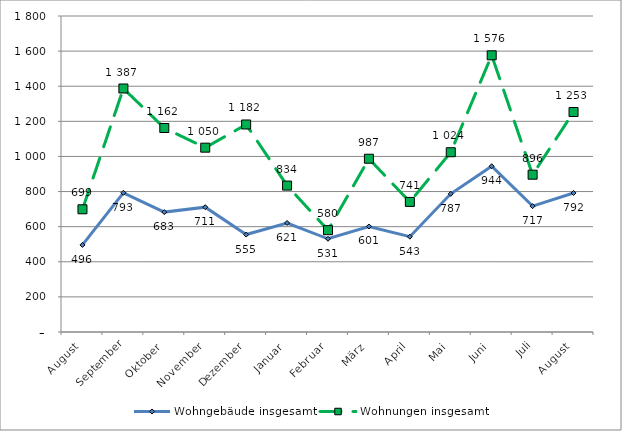
| Category | Wohngebäude insgesamt | Wohnungen insgesamt |
|---|---|---|
| August | 496 | 699 |
| September | 793 | 1387 |
| Oktober | 683 | 1162 |
| November | 711 | 1050 |
| Dezember | 555 | 1182 |
| Januar | 621 | 834 |
| Februar | 531 | 580 |
| März | 601 | 987 |
| April | 543 | 741 |
| Mai | 787 | 1024 |
| Juni | 944 | 1576 |
| Juli | 717 | 896 |
| August | 792 | 1253 |